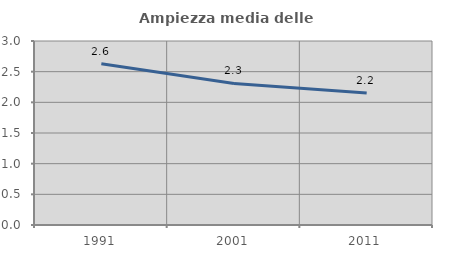
| Category | Ampiezza media delle famiglie |
|---|---|
| 1991.0 | 2.631 |
| 2001.0 | 2.308 |
| 2011.0 | 2.154 |